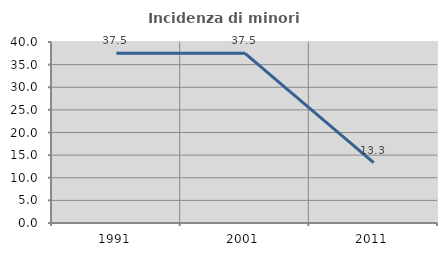
| Category | Incidenza di minori stranieri |
|---|---|
| 1991.0 | 37.5 |
| 2001.0 | 37.5 |
| 2011.0 | 13.333 |